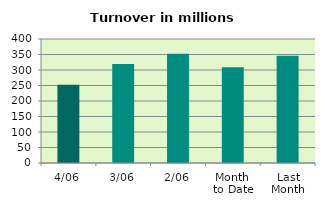
| Category | Series 0 |
|---|---|
| 4/06 | 252.646 |
| 3/06 | 319.715 |
| 2/06 | 352.315 |
| Month 
to Date | 308.835 |
| Last
Month | 346.329 |